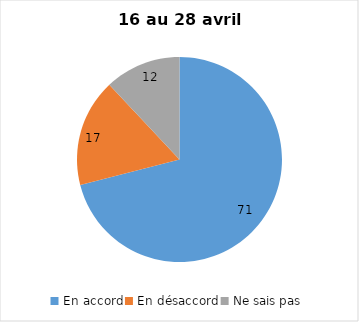
| Category | Series 0 |
|---|---|
| En accord | 71 |
| En désaccord | 17 |
| Ne sais pas | 12 |